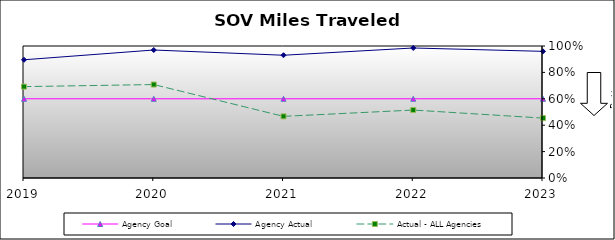
| Category | Agency Goal | Agency Actual | Actual - ALL Agencies |
|---|---|---|---|
| 2019.0 | 0.6 | 0.896 | 0.692 |
| 2020.0 | 0.6 | 0.97 | 0.708 |
| 2021.0 | 0.6 | 0.93 | 0.467 |
| 2022.0 | 0.6 | 0.985 | 0.515 |
| 2023.0 | 0.6 | 0.959 | 0.454 |